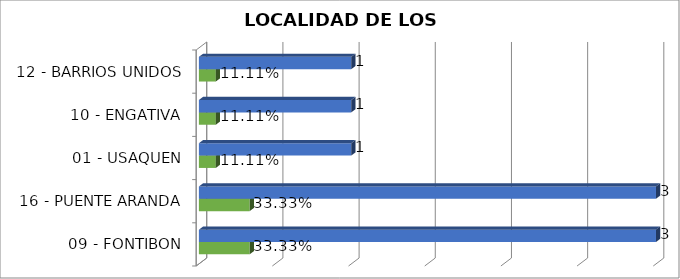
| Category | Cuenta de Número petición2 | Cuenta de Número petición |
|---|---|---|
| 09 - FONTIBON | 0.333 | 3 |
| 16 - PUENTE ARANDA | 0.333 | 3 |
| 01 - USAQUEN | 0.111 | 1 |
| 10 - ENGATIVA | 0.111 | 1 |
| 12 - BARRIOS UNIDOS | 0.111 | 1 |